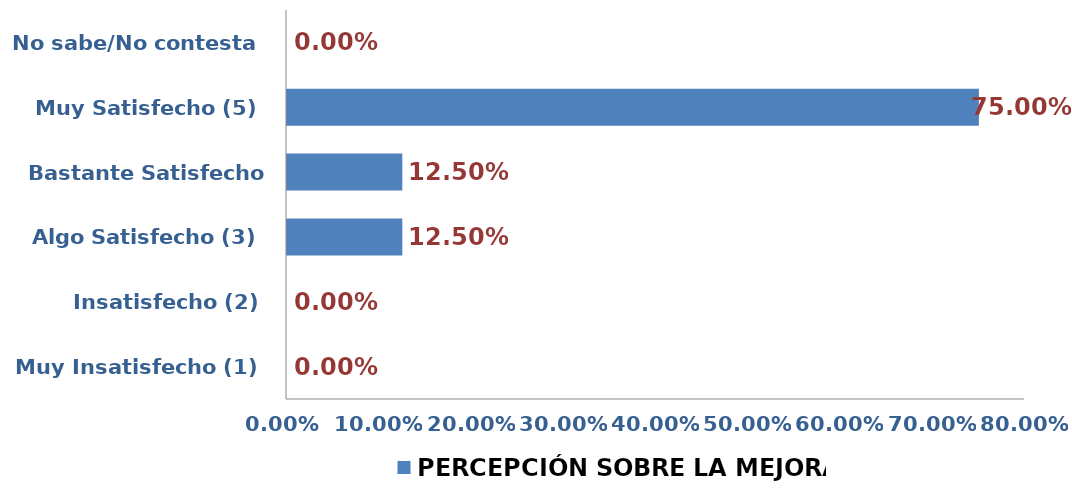
| Category | PERCEPCIÓN SOBRE LA MEJORA |
|---|---|
| Muy Insatisfecho (1) | 0 |
| Insatisfecho (2) | 0 |
| Algo Satisfecho (3) | 0.125 |
| Bastante Satisfecho (4) | 0.125 |
| Muy Satisfecho (5) | 0.75 |
| No sabe/No contesta | 0 |